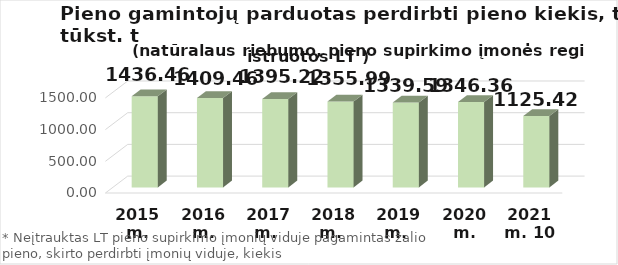
| Category | Lietuvos pieno supirkimo įmonėms* |
|---|---|
| 2015 m. | 1436.455 |
| 2016 m. | 1409.46 |
| 2017 m.  | 1395.224 |
| 2018 m.  | 1355.989 |
| 2019 m.  | 1339.59 |
| 2020 m. | 1346.36 |
| 2021 m. 10 mėn. | 1125.416 |